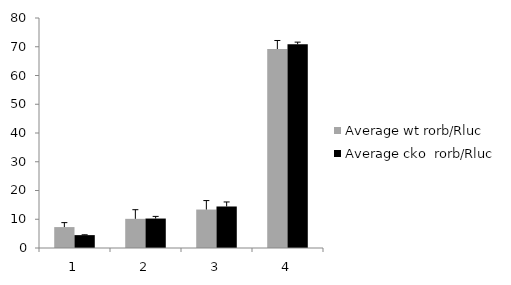
| Category | Average wt rorb/Rluc | Average cko  rorb/Rluc |
|---|---|---|
| 0 | 7.275 | 4.478 |
| 1 | 10.145 | 10.246 |
| 2 | 13.377 | 14.438 |
| 3 | 69.203 | 70.838 |